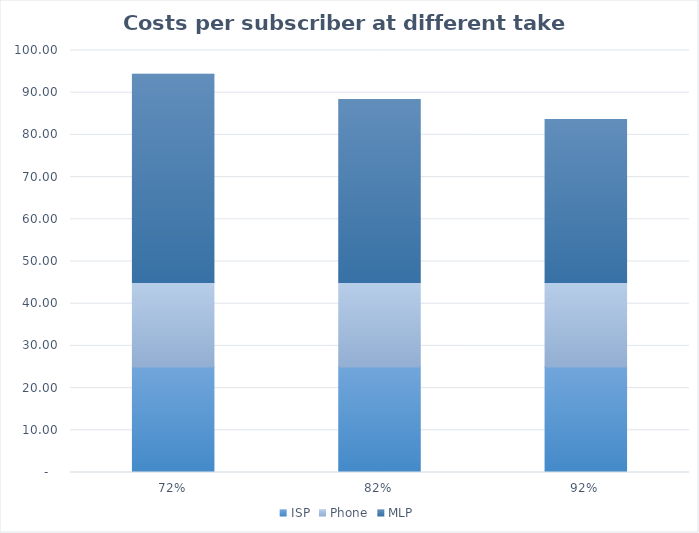
| Category | ISP | Phone | MLP |
|---|---|---|---|
| 0.72 | 25 | 20 | 49.397 |
| 0.82 | 25 | 20 | 43.373 |
| 0.9199999999999999 | 25 | 20 | 38.658 |